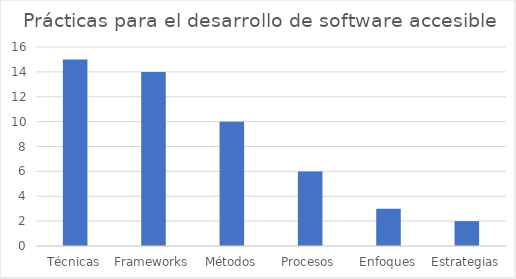
| Category | Total |
|---|---|
| Técnicas | 15 |
| Frameworks | 14 |
| Métodos | 10 |
| Procesos | 6 |
| Enfoques | 3 |
| Estrategias | 2 |